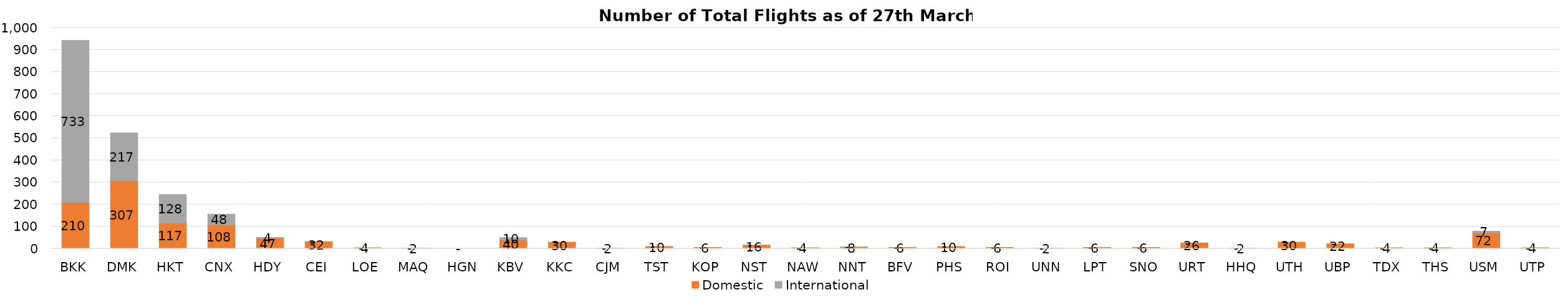
| Category | Domestic | International |
|---|---|---|
| BKK | 210 | 733 |
| DMK | 307 | 217 |
| HKT | 117 | 128 |
| CNX | 108 | 48 |
| HDY | 47 | 4 |
| CEI | 32 | 0 |
| LOE | 4 | 0 |
| MAQ | 2 | 0 |
| HGN | 0 | 0 |
| KBV | 40 | 10 |
| KKC | 30 | 0 |
| CJM | 2 | 0 |
| TST | 10 | 0 |
| KOP | 6 | 0 |
| NST | 16 | 0 |
| NAW | 4 | 0 |
| NNT | 8 | 0 |
| BFV | 6 | 0 |
| PHS | 10 | 0 |
| ROI | 6 | 0 |
| UNN | 2 | 0 |
| LPT | 6 | 0 |
| SNO | 6 | 0 |
| URT | 26 | 0 |
| HHQ | 2 | 0 |
| UTH | 30 | 0 |
| UBP | 22 | 0 |
| TDX | 4 | 0 |
| THS | 4 | 0 |
| USM | 72 | 7 |
| UTP | 4 | 0 |